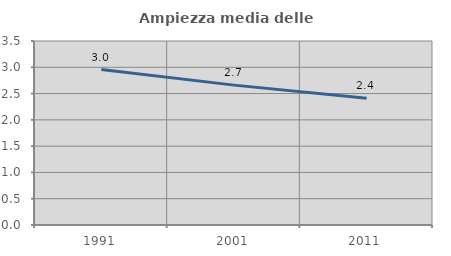
| Category | Ampiezza media delle famiglie |
|---|---|
| 1991.0 | 2.958 |
| 2001.0 | 2.661 |
| 2011.0 | 2.412 |